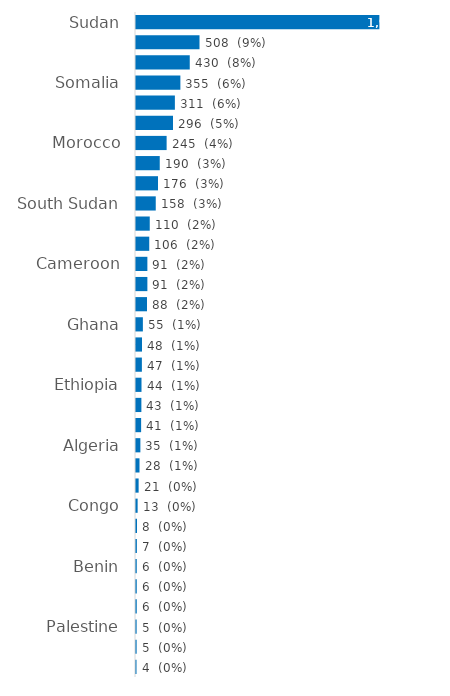
| Category | Sudan |
|---|---|
| Sudan | 1947 |
| Eritrea | 508 |
| Bangladesh | 430 |
| Somalia | 355 |
| Nigeria | 311 |
| Côte d'Ivoire | 296 |
| Morocco | 245 |
| Mali | 190 |
| Guinea | 176 |
| South Sudan | 158 |
| Chad | 110 |
| Egypt | 106 |
| Cameroon | 91 |
| Senegal | 91 |
| Libya | 88 |
| Ghana | 55 |
| Sierra Leone | 48 |
| Gambia | 47 |
| Ethiopia | 44 |
| Tunisia | 43 |
| Pakistan | 41 |
| Algeria | 35 |
| Niger | 28 |
| Others | 21 |
| Congo | 13 |
| Burkina Faso | 8 |
| Togo | 7 |
| Benin | 6 |
| Comoros | 6 |
| Guinea-Bissau | 6 |
| Palestine | 5 |
| Other (Sub-Saharan Africa) | 5 |
| Yemen | 4 |